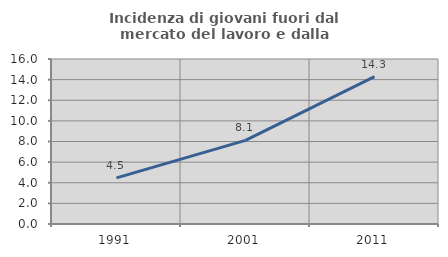
| Category | Incidenza di giovani fuori dal mercato del lavoro e dalla formazione  |
|---|---|
| 1991.0 | 4.478 |
| 2001.0 | 8.108 |
| 2011.0 | 14.286 |